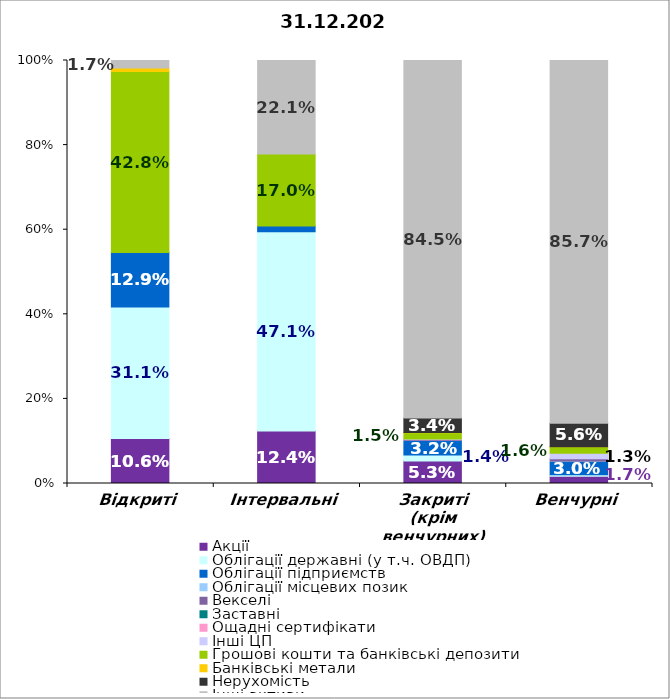
| Category | Акції | Облігації державні (у т.ч. ОВДП) | Облігації підприємств | Облігації місцевих позик | Векселі | Заставні | Ощадні сертифікати | Інші ЦП | Грошові кошти та банківські депозити | Банківські метали | Нерухомість | Інші активи |
|---|---|---|---|---|---|---|---|---|---|---|---|---|
| Відкриті | 0.106 | 0.311 | 0.129 |  | 0 | 0 |  | 0 | 0.428 | 0.009 | 0 | 0.017 |
| Інтервальні | 0.124 | 0.471 | 0.013 |  | 0 | 0 |  | 0 | 0.17 | 0 | 0 | 0.221 |
| Закриті (крім венчурних) | 0.053 | 0.014 | 0.032 |  | 0.004 | 0 |  | 0.002 | 0.015 | 0 | 0.034 | 0.845 |
| Венчурні | 0.017 | 0.003 | 0.03 |  | 0.008 | 0 |  | 0.013 | 0.016 | 0 | 0.056 | 0.857 |